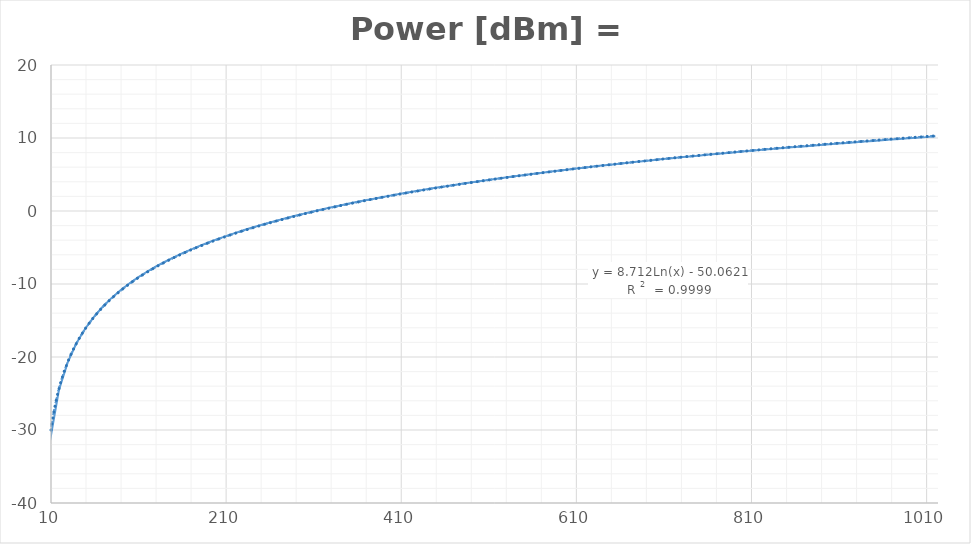
| Category | Power [dBm] |
|---|---|
| 1019.9999999999999 | 10.24 |
| 1009.0 | 10.12 |
| 999.0 | 10.04 |
| 989.0 | 9.95 |
| 979.0 | 9.87 |
| 969.0 | 9.78 |
| 959.0 | 9.69 |
| 949.0 | 9.6 |
| 939.0 | 9.51 |
| 929.0 | 9.41 |
| 919.0 | 9.33 |
| 909.0 | 9.24 |
| 899.0 | 9.14 |
| 889.0 | 9.05 |
| 879.0 | 8.95 |
| 869.0 | 8.85 |
| 859.0 | 8.76 |
| 849.0 | 8.65 |
| 839.0 | 8.55 |
| 829.0 | 8.45 |
| 819.0 | 8.35 |
| 809.0 | 8.24 |
| 799.0 | 8.14 |
| 789.0 | 8.03 |
| 779.0 | 7.92 |
| 769.0 | 7.81 |
| 759.0 | 7.7 |
| 749.0 | 7.58 |
| 739.0 | 7.47 |
| 729.0 | 7.35 |
| 719.0 | 7.23 |
| 709.0 | 7.12 |
| 699.0 | 6.99 |
| 689.0 | 6.86 |
| 679.0 | 6.74 |
| 669.0 | 6.6 |
| 659.0 | 6.48 |
| 649.0 | 6.35 |
| 639.0 | 6.22 |
| 629.0 | 6.08 |
| 619.0 | 5.94 |
| 609.0 | 5.81 |
| 599.0 | 5.66 |
| 589.0 | 5.51 |
| 579.0 | 5.37 |
| 569.0 | 5.22 |
| 559.0 | 5.06 |
| 549.0 | 4.91 |
| 539.0 | 4.75 |
| 529.0 | 4.58 |
| 519.0 | 4.42 |
| 509.0 | 4.25 |
| 499.0 | 4.09 |
| 489.0 | 3.91 |
| 479.0 | 3.73 |
| 469.0 | 3.54 |
| 459.0 | 3.36 |
| 449.0 | 3.17 |
| 439.0 | 2.97 |
| 429.0 | 2.77 |
| 419.0 | 2.57 |
| 409.0 | 2.36 |
| 399.0 | 2.14 |
| 389.0 | 1.92 |
| 379.0 | 1.69 |
| 369.0 | 1.46 |
| 359.0 | 1.23 |
| 349.0 | 0.98 |
| 339.0 | 0.73 |
| 329.0 | 0.47 |
| 319.0 | 0.2 |
| 309.0 | -0.07 |
| 299.0 | -0.36 |
| 289.0 | -0.66 |
| 279.0 | -0.97 |
| 269.0 | -1.28 |
| 259.0 | -1.61 |
| 249.0 | -1.95 |
| 239.0 | -2.3 |
| 229.0 | -2.67 |
| 219.0 | -3.06 |
| 209.0 | -3.47 |
| 199.0 | -3.89 |
| 189.0 | -4.35 |
| 179.0 | -4.82 |
| 169.0 | -5.32 |
| 159.0 | -5.85 |
| 149.0 | -6.42 |
| 139.0 | -7.02 |
| 129.0 | -7.67 |
| 119.0 | -8.36 |
| 109.0 | -9.13 |
| 99.0 | -9.97 |
| 89.0 | -10.89 |
| 79.0 | -11.94 |
| 69.0 | -13.12 |
| 59.0 | -14.5 |
| 49.0 | -16.13 |
| 39.0 | -18.12 |
| 29.0 | -20.77 |
| 19.0 | -24.55 |
| 9.0 | -31.4 |